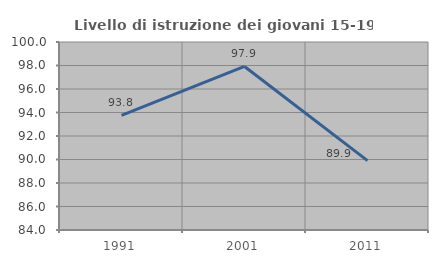
| Category | Livello di istruzione dei giovani 15-19 anni |
|---|---|
| 1991.0 | 93.75 |
| 2001.0 | 97.917 |
| 2011.0 | 89.908 |